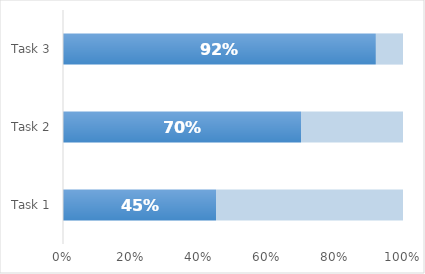
| Category | Performance | Remaining |
|---|---|---|
| Task 1 | 0.45 | 0.55 |
| Task 2 | 0.7 | 0.3 |
| Task 3 | 0.92 | 0.08 |